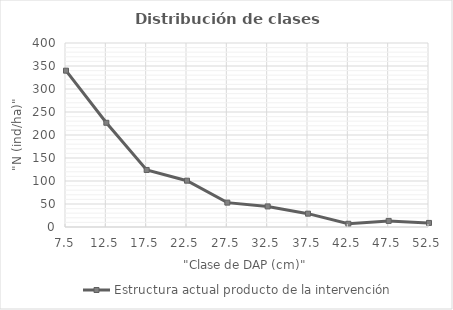
| Category | Estructura actual producto de la intervención |
|---|---|
| 7.5 | 339.86 |
| 12.5 | 226.573 |
| 17.5 | 124 |
| 22.5 | 100.699 |
| 27.5 | 53 |
| 32.5 | 44.755 |
| 37.5 | 29 |
| 42.5 | 7 |
| 47.5 | 13.261 |
| 52.5 | 8.841 |